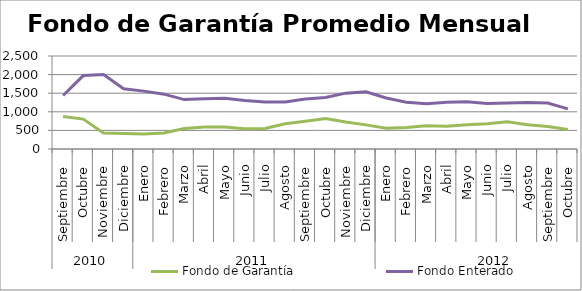
| Category | Fondo de Garantía | Fondo Enterado |
|---|---|---|
| 0 | 871.43 | 1439.553 |
| 1 | 804.208 | 1973.732 |
| 2 | 428.758 | 2004.096 |
| 3 | 417.974 | 1620.905 |
| 4 | 403.651 | 1555.632 |
| 5 | 429.02 | 1474.054 |
| 6 | 551.344 | 1328.521 |
| 7 | 591.732 | 1351.463 |
| 8 | 591.784 | 1363.301 |
| 9 | 544.875 | 1304.985 |
| 10 | 551.606 | 1265.502 |
| 11 | 679.839 | 1266.018 |
| 12 | 747.74 | 1344.929 |
| 13 | 819.75 | 1383.171 |
| 14 | 723.635 | 1501.378 |
| 15 | 648.288 | 1537.485 |
| 16 | 560.173 | 1370.992 |
| 17 | 575.916 | 1258.831 |
| 18 | 622.075 | 1216.471 |
| 19 | 612.299 | 1258.963 |
| 20 | 654.277 | 1273.362 |
| 21 | 675.965 | 1225.977 |
| 22 | 729.97 | 1235.91 |
| 23 | 649.095 | 1253.333 |
| 24 | 606.03 | 1237.548 |
| 25 | 525.314 | 1079.857 |